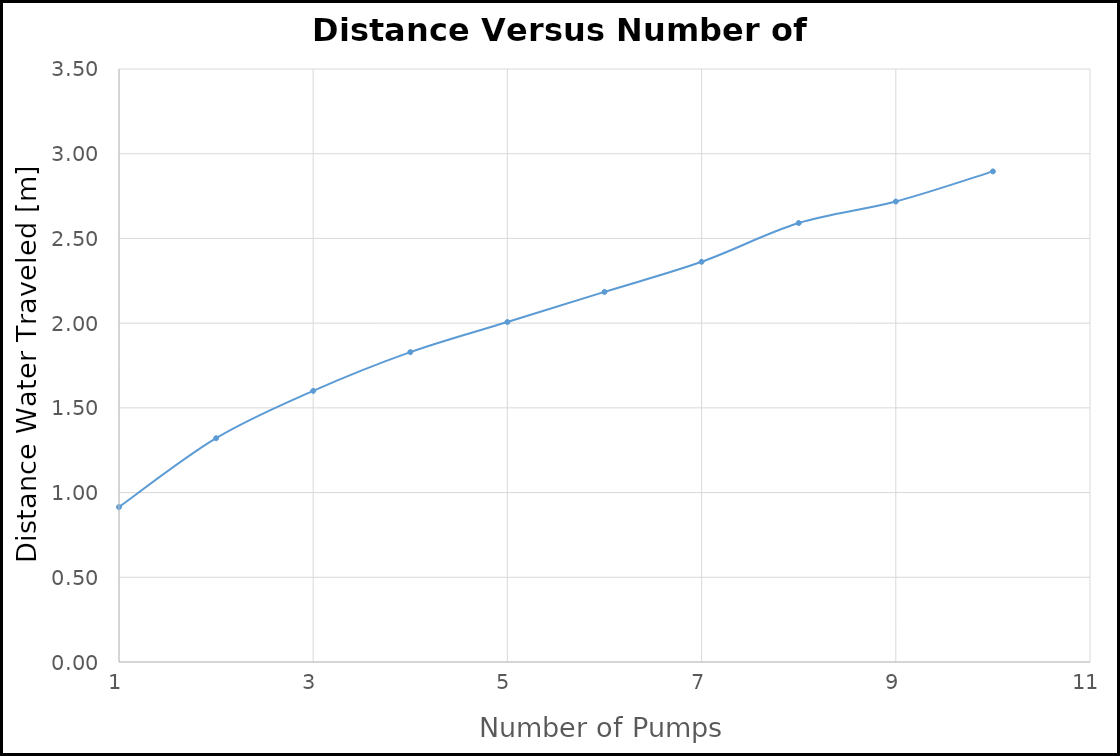
| Category | Series 0 |
|---|---|
| 1.0 | 0.914 |
| 2.0 | 1.321 |
| 3.0 | 1.6 |
| 4.0 | 1.829 |
| 5.0 | 2.007 |
| 6.0 | 2.184 |
| 7.0 | 2.362 |
| 8.0 | 2.591 |
| 9.0 | 2.718 |
| 10.0 | 2.896 |